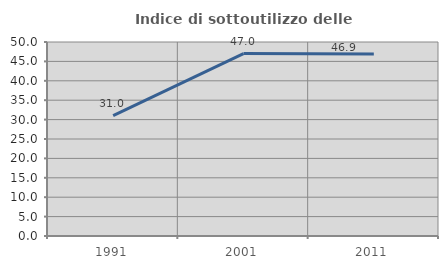
| Category | Indice di sottoutilizzo delle abitazioni  |
|---|---|
| 1991.0 | 31.034 |
| 2001.0 | 47.005 |
| 2011.0 | 46.904 |